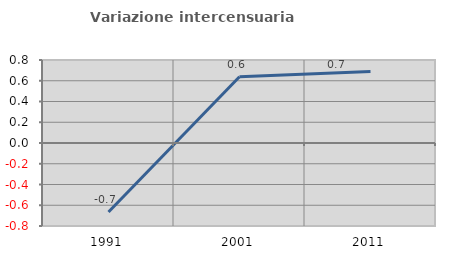
| Category | Variazione intercensuaria annua |
|---|---|
| 1991.0 | -0.665 |
| 2001.0 | 0.639 |
| 2011.0 | 0.689 |